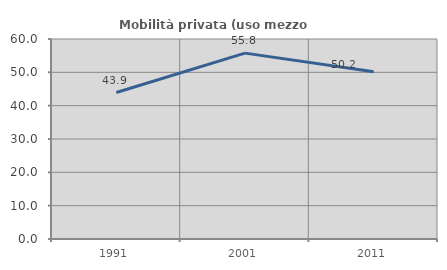
| Category | Mobilità privata (uso mezzo privato) |
|---|---|
| 1991.0 | 43.938 |
| 2001.0 | 55.765 |
| 2011.0 | 50.202 |